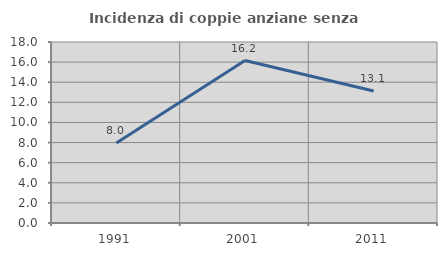
| Category | Incidenza di coppie anziane senza figli  |
|---|---|
| 1991.0 | 7.958 |
| 2001.0 | 16.154 |
| 2011.0 | 13.122 |